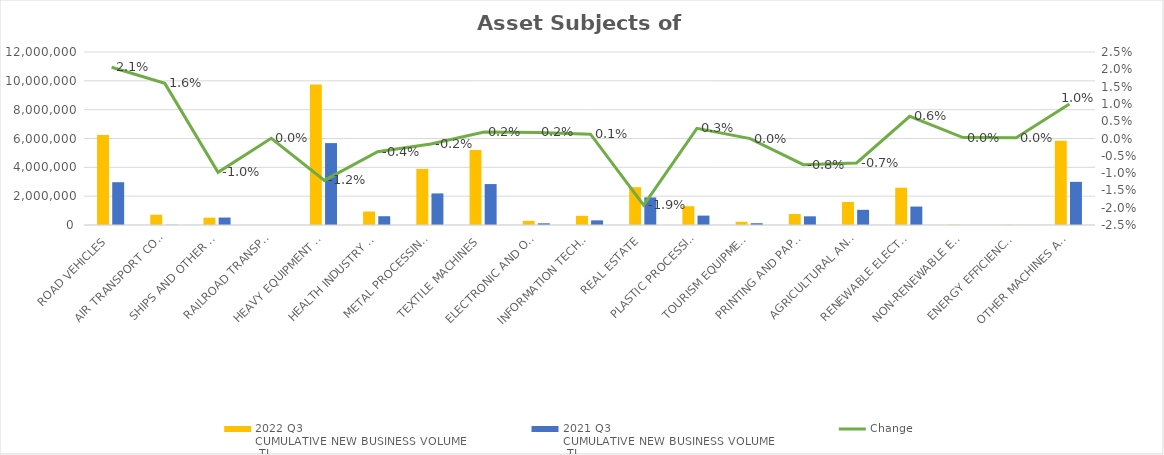
| Category | 2022 Q3 
CUMULATIVE NEW BUSINESS VOLUME
 TL | 2021 Q3 
CUMULATIVE NEW BUSINESS VOLUME
 TL |
|---|---|---|
| ROAD VEHICLES | 6249692.014 | 2967853.993 |
| AIR TRANSPORT CONVEYANCE | 710489 | 12757 |
| SHIPS AND OTHER SEA-GOING VESSELS | 511733.318 | 516931.098 |
| RAILROAD TRANSPORT VEHICLES | 3944 | 293 |
| HEAVY EQUIPMENT AND CONSTRUCTION MACHINERY | 9741021.203 | 5680976.457 |
| HEALTH INDUSTRY AND AESTHETIC INSTRUMENTS | 935328.65 | 609011.559 |
| METAL PROCESSING MACHINE | 3889618.72 | 2190474.218 |
| TEXTILE MACHINES | 5210920.283 | 2839234.288 |
| ELECTRONIC AND OPTICAL DEVICES | 287703.771 | 117560.782 |
| INFORMATION TECHNOLOGIES AND OFFICE SYSTEMS | 635054.48 | 321937.527 |
| REAL ESTATE | 2624353.991 | 1912992.305 |
| PLASTIC PROCESSING MACHINES | 1303954.526 | 651604.318 |
| TOURISM EQUIPMENT | 222090.276 | 123802.974 |
| PRINTING AND PAPER PROCESSING MACHINES | 761664.165 | 602172.452 |
| AGRICULTURAL AND LIVESTOCK FARMING MACHINES | 1598284.433 | 1053192.501 |
| RENEWABLE ELECTRICITY GENERATION | 2587958.204 | 1279280.813 |
| NON-RENEWABLE ELECTRIC ENERGY GENERATION | 16340.788 | 2857 |
| ENERGY EFFICIENCY EQUIPMENT | 15111.342 | 3661.684 |
| OTHER MACHINES AND EQUIPMENT | 5836067.32 | 2992170.921 |